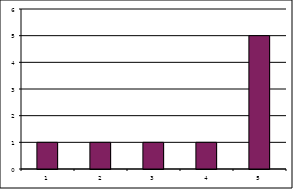
| Category | Series 1 |
|---|---|
| 0 | 1 |
| 1 | 1 |
| 2 | 1 |
| 3 | 1 |
| 4 | 5 |